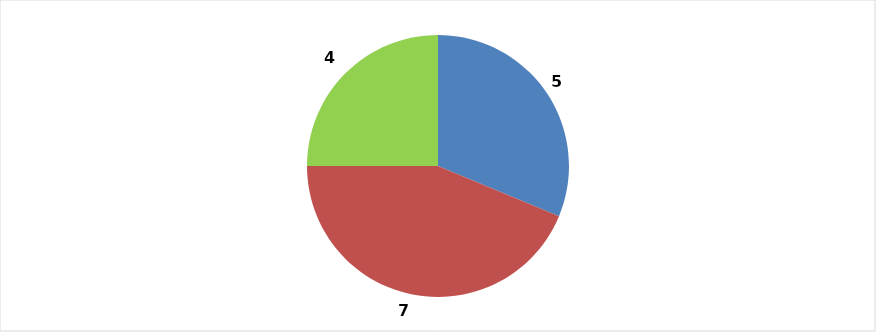
| Category | ENERO |
|---|---|
| ENERO | 5 |
| FEBRERO | 7 |
| MARZO | 4 |